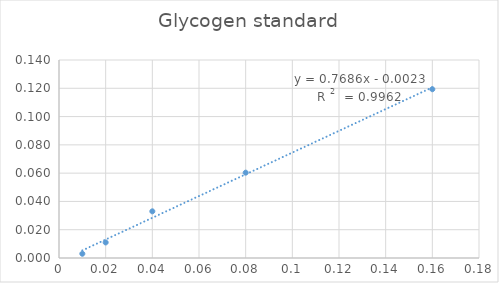
| Category | Series 0 |
|---|---|
| 0.01 | 0.003 |
| 0.02 | 0.011 |
| 0.04 | 0.033 |
| 0.08 | 0.06 |
| 0.16 | 0.119 |